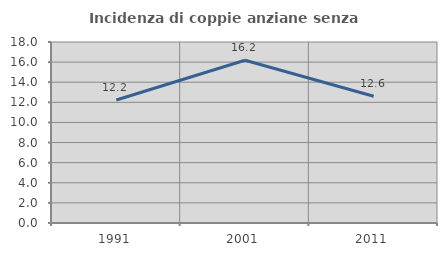
| Category | Incidenza di coppie anziane senza figli  |
|---|---|
| 1991.0 | 12.235 |
| 2001.0 | 16.183 |
| 2011.0 | 12.605 |